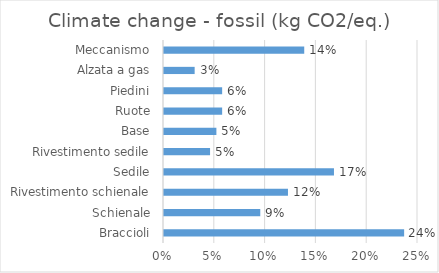
| Category | Climate change - fossil (kg CO2/eq.) |
|---|---|
| Braccioli | 0.236 |
| Schienale | 0.095 |
| Rivestimento schienale | 0.122 |
| Sedile | 0.167 |
| Rivestimento sedile | 0.045 |
| Base | 0.052 |
| Ruote | 0.057 |
| Piedini | 0.057 |
| Alzata a gas | 0.03 |
| Meccanismo | 0.138 |